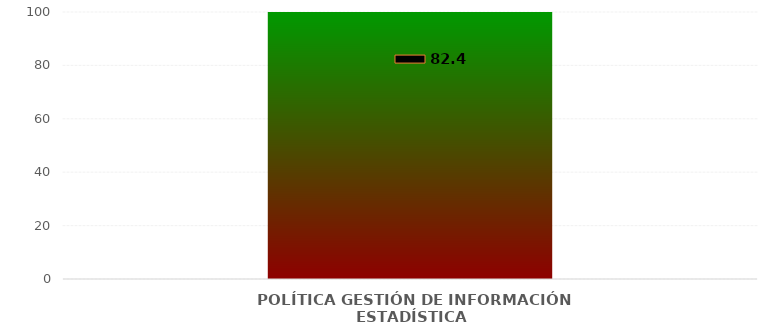
| Category | Niveles |
|---|---|
| 0 | 100 |